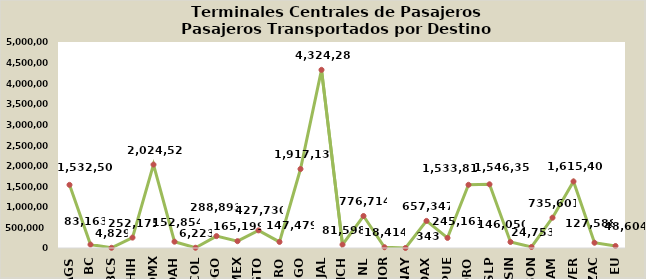
| Category | ESTADO DESTINO |
|---|---|
| AGS | 1532506 |
| BC | 83163 |
| BCS | 4829 |
| CHIH | 252175.3 |
| CDMX | 2024525.8 |
| COAH | 152853.6 |
| COL | 6223 |
| DGO | 288893 |
| MEX | 165199 |
| GTO | 427730 |
| GRO | 147479.3 |
| HGO | 1917131.1 |
| JAL | 4324280 |
| MICH | 81598 |
| NL | 776713.6 |
| MOR | 18414 |
| NAY | 343 |
| OAX | 657347 |
| PUE | 245161 |
| QRO | 1533818.1 |
| SLP | 1546353.9 |
| SIN | 146050.3 |
| SON | 24753 |
| TAM | 735601.1 |
| VER | 1615408.2 |
| ZAC | 127588 |
| EU | 48604 |